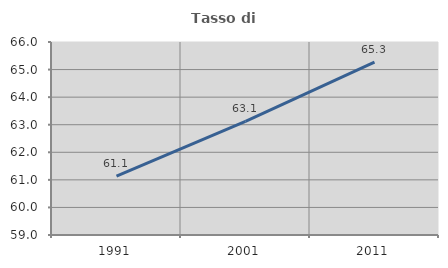
| Category | Tasso di occupazione   |
|---|---|
| 1991.0 | 61.132 |
| 2001.0 | 63.121 |
| 2011.0 | 65.271 |